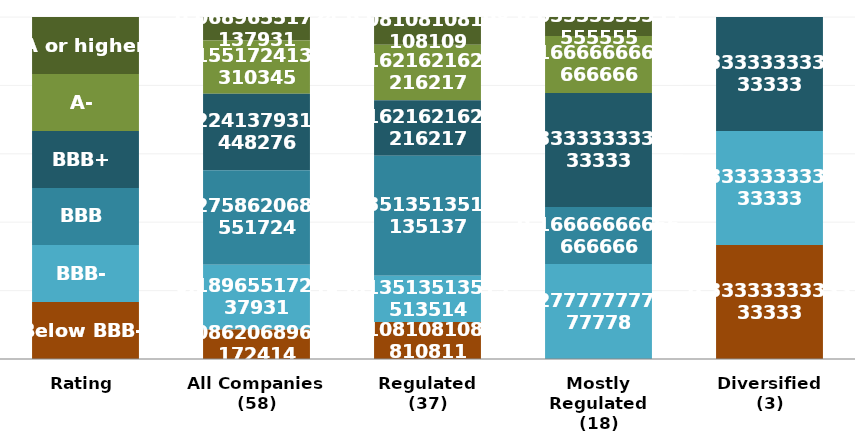
| Category | A or higher | A- | BBB+ | BBB | BBB- | Below BBB- |
|---|---|---|---|---|---|---|
| Rating | 1 | 1 | 1 | 1 | 1 | 1 |
| All Companies
(58) | 4 | 9 | 13 | 16 | 11 | 5 |
| Regulated
(37) | 3 | 6 | 6 | 13 | 5 | 4 |
| Mostly Regulated
(18) | 1 | 3 | 6 | 3 | 5 | 0 |
| Diversified
(3) | 0 | 0 | 1 | 0 | 1 | 1 |